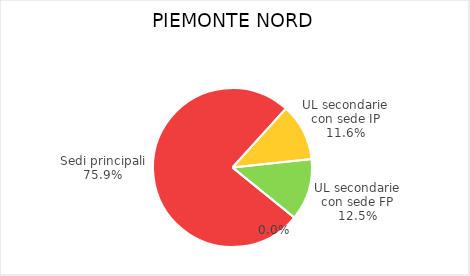
| Category | Piemonte Nord |
|---|---|
| Sedi principali | 41522 |
| UL secondarie con sede IP | 6341 |
| UL secondarie con sede FP | 6863 |